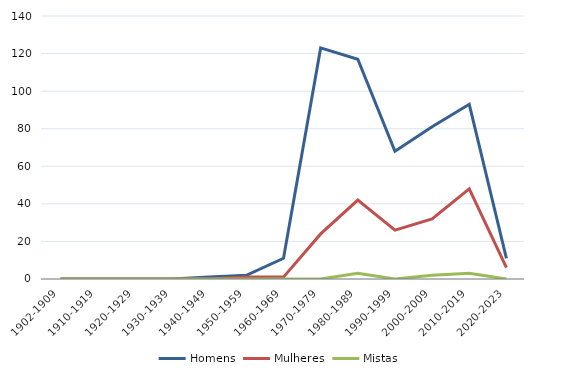
| Category | Homens | Mulheres | Mistas |
|---|---|---|---|
| 1902-1909 | 0 | 0 | 0 |
| 1910-1919 | 0 | 0 | 0 |
| 1920-1929 | 0 | 0 | 0 |
| 1930-1939 | 0 | 0 | 0 |
| 1940-1949 | 1 | 0 | 0 |
| 1950-1959 | 2 | 1 | 0 |
| 1960-1969 | 11 | 1 | 0 |
| 1970-1979 | 123 | 24 | 0 |
| 1980-1989 | 117 | 42 | 3 |
| 1990-1999 | 68 | 26 | 0 |
| 2000-2009 | 81 | 32 | 2 |
| 2010-2019 | 93 | 48 | 3 |
| 2020-2023 | 11 | 6 | 0 |